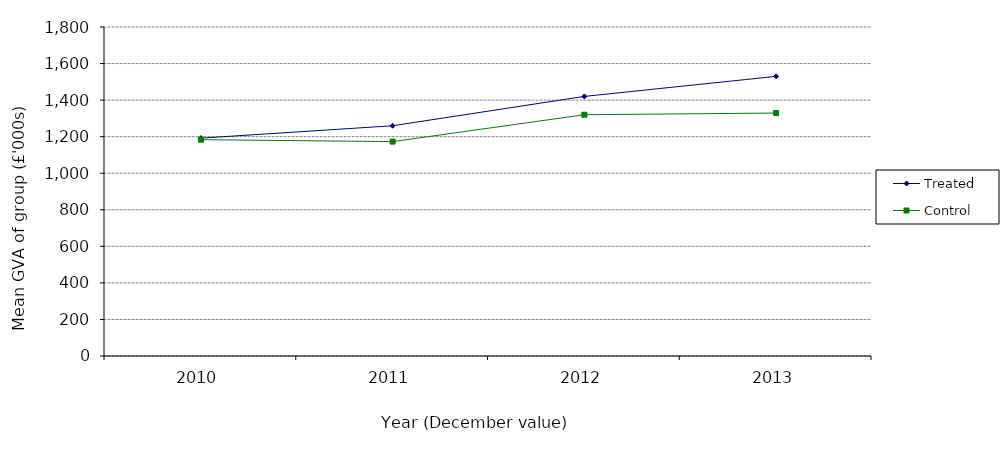
| Category | Treated | Control |
|---|---|---|
| 2010.0 | 1192.004 | 1183.499 |
| 2011.0 | 1259.679 | 1172.924 |
| 2012.0 | 1420.185 | 1319.97 |
| 2013.0 | 1530.015 | 1329.291 |